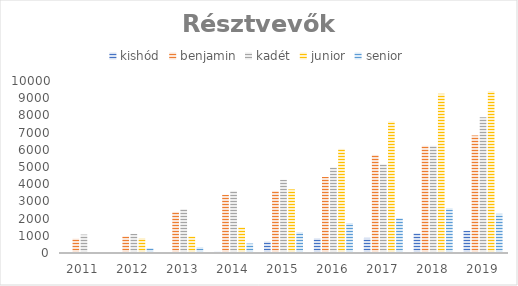
| Category | kishód | benjamin | kadét | junior | senior |
|---|---|---|---|---|---|
| 2011 | 0 | 835 | 1072 | 0 | 0 |
| 2012 | 0 | 967 | 1110 | 869 | 287 |
| 2013 | 0 | 2390 | 2550 | 965 | 341 |
| 2014 | 75 | 3383 | 3610 | 1489 | 549 |
| 2015 | 666 | 3609 | 4257 | 3698 | 1208 |
| 2016 | 854 | 4419 | 4974 | 6054 | 1745 |
| 2017 | 879 | 5703 | 5155 | 7647 | 2027 |
| 2018 | 1145 | 6232 | 6232 | 9254 | 2601 |
| 2019 | 1293 | 6834 | 7893 | 9404 | 2278 |